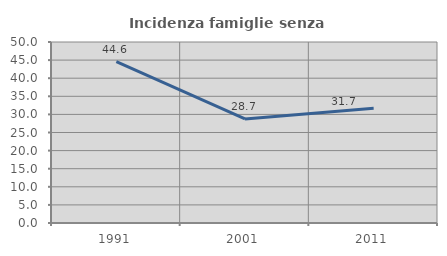
| Category | Incidenza famiglie senza nuclei |
|---|---|
| 1991.0 | 44.578 |
| 2001.0 | 28.736 |
| 2011.0 | 31.667 |